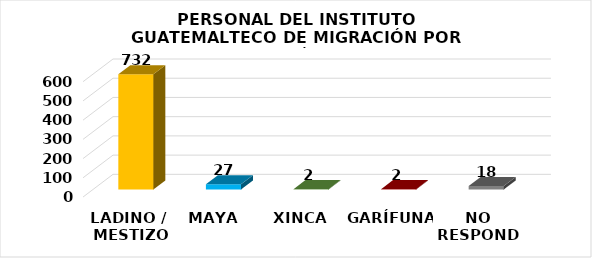
| Category | Series 0 |
|---|---|
| LADINO /
 MESTIZO | 732 |
| MAYA | 27 |
| XINCA | 2 |
| GARÍFUNA | 2 |
| NO RESPONDE | 18 |